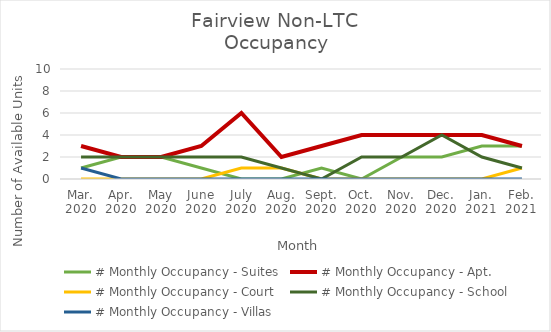
| Category | # Monthly Occupancy - Suites | # Monthly Occupancy - Apt. | # Monthly Occupancy - Court | # Monthly Occupancy - School | # Monthly Occupancy - Villas |
|---|---|---|---|---|---|
| Mar.
2020 | 1 | 3 | 0 | 2 | 1 |
| Apr.
2020 | 2 | 2 | 0 | 2 | 0 |
| May
2020 | 2 | 2 | 0 | 2 | 0 |
| June
2020 | 1 | 3 | 0 | 2 | 0 |
| July
2020 | 0 | 6 | 1 | 2 | 0 |
| Aug.
2020 | 0 | 2 | 1 | 1 | 0 |
| Sept.
2020 | 1 | 3 | 0 | 0 | 0 |
| Oct.
2020 | 0 | 4 | 0 | 2 | 0 |
| Nov.
2020 | 2 | 4 | 0 | 2 | 0 |
| Dec.
2020 | 2 | 4 | 0 | 4 | 0 |
| Jan.
2021 | 3 | 4 | 0 | 2 | 0 |
| Feb.
2021 | 3 | 3 | 1 | 1 | 0 |